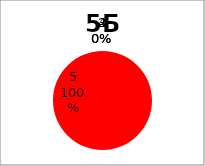
| Category | Series 0 |
|---|---|
| 5.0 | 9 |
| 4.0 | 0 |
| 3.0 | 0 |
| 2.0 | 0 |